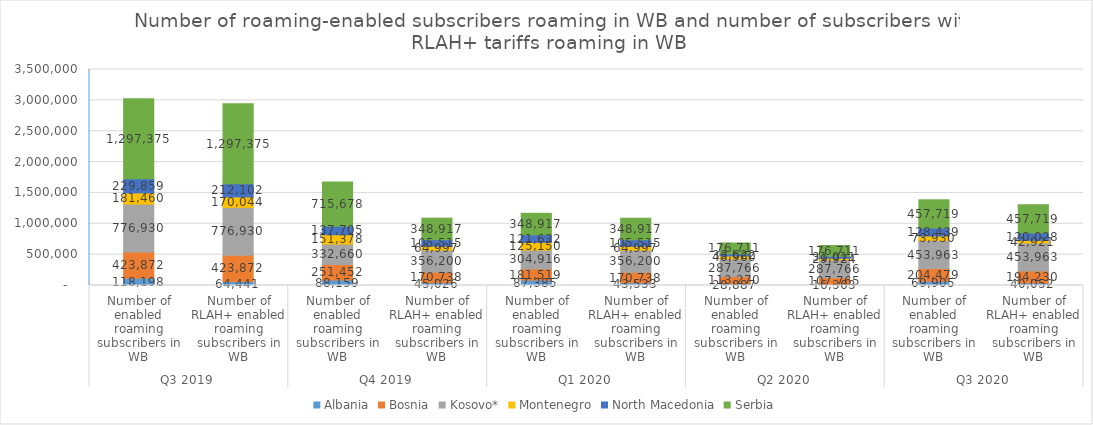
| Category | Albania | Bosnia | Kosovo* | Montenegro | North Macedonia | Serbia |
|---|---|---|---|---|---|---|
| 0 | 118198 | 423872 | 776930 | 181460 | 229859 | 1297375 |
| 1 | 64441 | 423872 | 776930 | 170044 | 212102 | 1297375 |
| 2 | 88159 | 251452 | 332660 | 151378 | 137705 | 715678 |
| 3 | 45026 | 170738 | 356200 | 64997 | 105515 | 348917 |
| 4 | 87385 | 181519 | 304916 | 125150 | 121632 | 348917 |
| 5 | 43533 | 170738 | 356200 | 64997 | 105515 | 348917 |
| 6 | 28887 | 113270 | 287766 | 48960 | 33622 | 176711 |
| 7 | 16363 | 107765 | 287766 | 29924 | 31011 | 176711 |
| 8 | 69905 | 204479 | 453963 | 73930 | 128439 | 457719 |
| 9 | 40052 | 194230 | 453963 | 42921 | 120028 | 457719 |